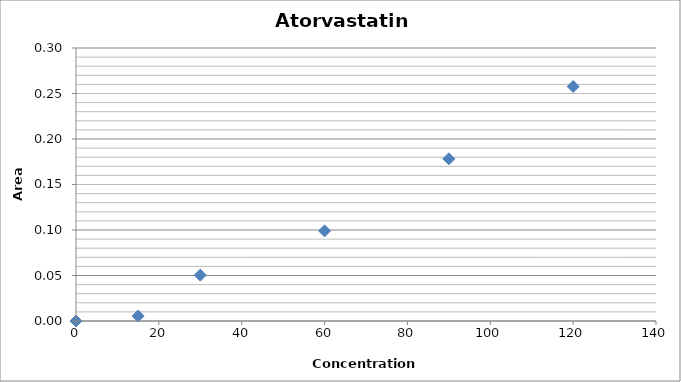
| Category | Series 0 |
|---|---|
| 0.0 | 0 |
| 15.0 | 0.005 |
| 30.0 | 0.05 |
| 60.0 | 0.099 |
| 90.0 | 0.178 |
| 120.0 | 0.258 |